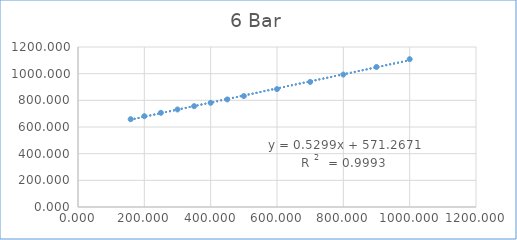
| Category | Series 0 |
|---|---|
| 158.8 | 658.409 |
| 200.0 | 680.984 |
| 250.0 | 706.546 |
| 300.0 | 731.486 |
| 350.0 | 756.355 |
| 400.0 | 781.366 |
| 450.0 | 806.617 |
| 500.0 | 832.155 |
| 600.0 | 884.305 |
| 700.0 | 937.984 |
| 800.0 | 993.287 |
| 900.0 | 1050.215 |
| 1000.0 | 1108.72 |